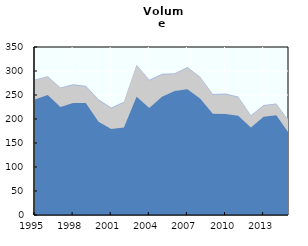
| Category | Marine landings + Aquaculture + Inland fisheries | Marine landings + Aquaculture | Marine landings |
|---|---|---|---|
| 1995.0 | 282.505 | 281.109 | 240.7 |
| 1996.0 | 289.131 | 287.707 | 250 |
| 1997.0 | 265.608 | 264.253 | 224.837 |
| 1998.0 | 272.144 | 270.185 | 233.538 |
| 1999.0 | 269.19 | 267.205 | 233.528 |
| 2000.0 | 240.947 | 238.81 | 194.06 |
| 2001.0 | 223.991 | 222.099 | 179.099 |
| 2002.0 | 235.937 | 234.111 | 182.111 |
| 2003.0 | 313.254 | 311.389 | 246.527 |
| 2004.0 | 281.728 | 279.806 | 223.134 |
| 2005.0 | 294.014 | 292.298 | 246.529 |
| 2006.0 | 295.33 | 293.589 | 258.539 |
| 2007.0 | 308.187 | 306.454 | 261.791 |
| 2008.0 | 287.97 | 286.674 | 242.732 |
| 2009.0 | 252.109 | 250.188 | 211.148 |
| 2010.0 | 252.958 | 251.133 | 210.436 |
| 2011.0 | 246.698 | 244.752 | 206.676 |
| 2012.0 | 207.856 | 206.235 | 182.261 |
| 2013.0 | 229.297 | 227.504 | 204.855 |
| 2014.0 | 232.27 | 230.809 | 207.606 |
| 2015.0 | 195.889 | 194.412 | 170.146 |